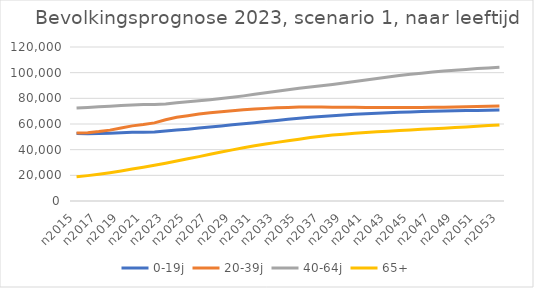
| Category | 0-19j | 20-39j | 40-64j | 65+ |
|---|---|---|---|---|
| n2015 | 52620 | 53075 | 72402 | 18838 |
| n2016 | 52467 | 53236 | 72826 | 19773 |
| n2017 | 52646 | 54074 | 73358 | 20842 |
| n2018 | 52859 | 55229 | 73877 | 22066 |
| n2019 | 53196 | 56878 | 74389 | 23435 |
| n2020 | 53577 | 58541 | 74834 | 24892 |
| n2021 | 53611 | 59548 | 75207 | 26345 |
| n2022 | 53854 | 60864 | 75289 | 27795 |
| n2023 | 54532 | 63299 | 75594 | 29419 |
| n2024 | 55275 | 65318 | 76495 | 31163 |
| n2025 | 55995 | 66488 | 77277 | 32867 |
| n2026 | 56839 | 67733 | 78096 | 34572 |
| n2027 | 57683 | 68698 | 78960 | 36405 |
| n2028 | 58515 | 69597 | 79834 | 38173 |
| n2029 | 59356 | 70308 | 80883 | 39858 |
| n2030 | 60166 | 71024 | 81911 | 41497 |
| n2031 | 60995 | 71661 | 83097 | 43016 |
| n2032 | 61904 | 72174 | 84336 | 44411 |
| n2033 | 62768 | 72628 | 85558 | 45687 |
| n2034 | 63672 | 72885 | 86748 | 46912 |
| n2035 | 64494 | 73165 | 87808 | 48178 |
| n2036 | 65242 | 73292 | 88778 | 49396 |
| n2037 | 65885 | 73218 | 89747 | 50459 |
| n2038 | 66506 | 73129 | 90819 | 51349 |
| n2039 | 67077 | 73038 | 91982 | 52090 |
| n2040 | 67533 | 73042 | 93143 | 52745 |
| n2041 | 68034 | 72904 | 94369 | 53331 |
| n2042 | 68434 | 72856 | 95538 | 53880 |
| n2043 | 68824 | 72829 | 96655 | 54382 |
| n2044 | 69160 | 72843 | 97722 | 54856 |
| n2045 | 69446 | 72917 | 98686 | 55323 |
| n2046 | 69734 | 72930 | 99574 | 55848 |
| n2047 | 69981 | 72995 | 100471 | 56275 |
| n2048 | 70167 | 73087 | 101266 | 56706 |
| n2049 | 70331 | 73230 | 101934 | 57206 |
| n2050 | 70475 | 73416 | 102557 | 57700 |
| n2051 | 70611 | 73588 | 103189 | 58180 |
| n2052 | 70727 | 73822 | 103682 | 58744 |
| n2053 | 70821 | 74107 | 104136 | 59287 |